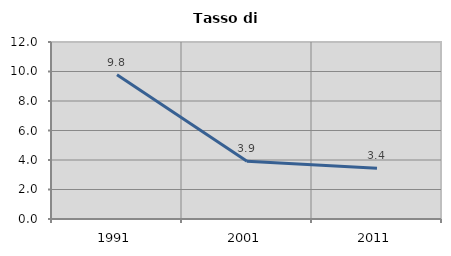
| Category | Tasso di disoccupazione   |
|---|---|
| 1991.0 | 9.786 |
| 2001.0 | 3.912 |
| 2011.0 | 3.442 |